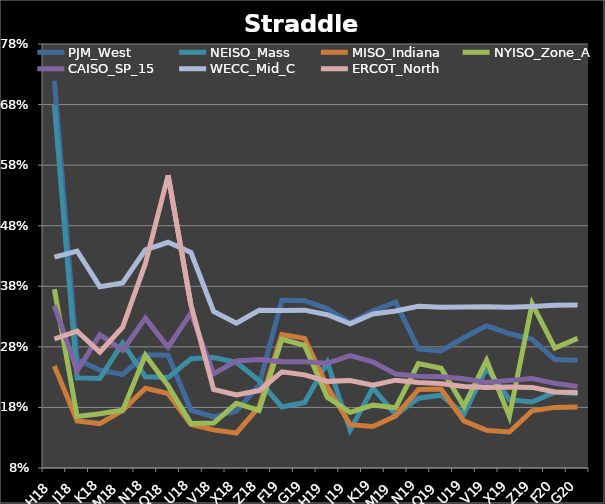
| Category | PJM_West | NEISO_Mass | MISO_Indiana | NYISO_Zone_A | CAISO_SP_15 | WECC_Mid_C | ERCOT_North |
|---|---|---|---|---|---|---|---|
| H18 | 0.72 | 0.679 | 0.249 | 0.375 | 0.348 | 0.428 | 0.293 |
| J18 | 0.259 | 0.229 | 0.158 | 0.165 | 0.241 | 0.438 | 0.306 |
| K18 | 0.242 | 0.228 | 0.153 | 0.17 | 0.3 | 0.379 | 0.271 |
| M18 | 0.234 | 0.286 | 0.175 | 0.175 | 0.274 | 0.386 | 0.312 |
| N18 | 0.267 | 0.231 | 0.212 | 0.266 | 0.327 | 0.44 | 0.417 |
| Q18 | 0.266 | 0.229 | 0.203 | 0.216 | 0.279 | 0.453 | 0.563 |
| U18 | 0.176 | 0.26 | 0.152 | 0.154 | 0.336 | 0.436 | 0.35 |
| V18 | 0.164 | 0.262 | 0.143 | 0.154 | 0.236 | 0.339 | 0.21 |
| X18 | 0.174 | 0.254 | 0.138 | 0.187 | 0.257 | 0.319 | 0.201 |
| Z18 | 0.217 | 0.224 | 0.181 | 0.175 | 0.259 | 0.34 | 0.208 |
| F19 | 0.357 | 0.181 | 0.3 | 0.292 | 0.255 | 0.34 | 0.239 |
| G19 | 0.356 | 0.188 | 0.294 | 0.282 | 0.256 | 0.341 | 0.234 |
| H19 | 0.343 | 0.254 | 0.214 | 0.197 | 0.253 | 0.333 | 0.223 |
| J19 | 0.32 | 0.143 | 0.152 | 0.172 | 0.266 | 0.318 | 0.224 |
| K19 | 0.339 | 0.212 | 0.149 | 0.184 | 0.255 | 0.334 | 0.217 |
| M19 | 0.354 | 0.168 | 0.166 | 0.179 | 0.235 | 0.339 | 0.225 |
| N19 | 0.277 | 0.195 | 0.21 | 0.253 | 0.232 | 0.347 | 0.221 |
| Q19 | 0.273 | 0.2 | 0.21 | 0.245 | 0.231 | 0.346 | 0.219 |
| U19 | 0.295 | 0.169 | 0.158 | 0.182 | 0.227 | 0.346 | 0.214 |
| V19 | 0.315 | 0.245 | 0.142 | 0.258 | 0.221 | 0.346 | 0.213 |
| X19 | 0.302 | 0.193 | 0.139 | 0.165 | 0.225 | 0.346 | 0.214 |
| Z19 | 0.292 | 0.189 | 0.174 | 0.351 | 0.228 | 0.347 | 0.213 |
| F20 | 0.259 | 0.205 | 0.18 | 0.278 | 0.22 | 0.349 | 0.206 |
| G20 | 0.258 | 0.203 | 0.181 | 0.294 | 0.214 | 0.349 | 0.205 |